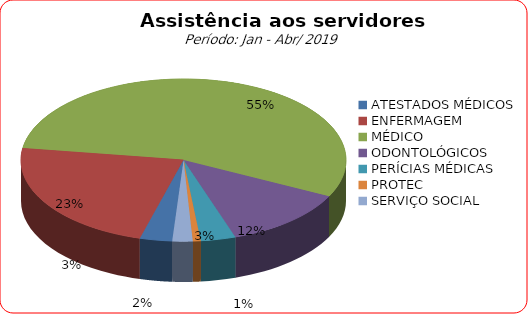
| Category | Series 0 |
|---|---|
| ATESTADOS MÉDICOS | 3.214 |
| ENFERMAGEM | 22.965 |
| MÉDICO | 55.054 |
| ODONTOLÓGICOS | 12.494 |
| PERÍCIAS MÉDICAS | 3.473 |
| PROTEC | 0.778 |
| SERVIÇO SOCIAL | 2.022 |